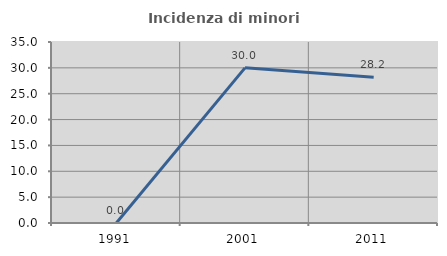
| Category | Incidenza di minori stranieri |
|---|---|
| 1991.0 | 0 |
| 2001.0 | 30 |
| 2011.0 | 28.205 |